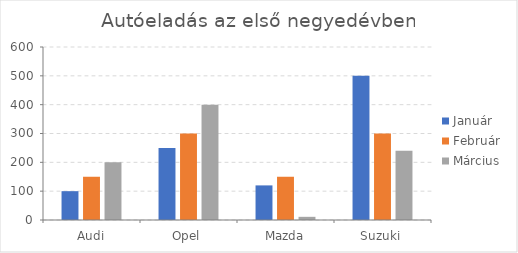
| Category | Január | Február | Március |
|---|---|---|---|
| Audi | 100 | 150 | 200 |
| Opel | 250 | 300 | 400 |
| Mazda | 120 | 150 | 11 |
| Suzuki | 500 | 300 | 240 |